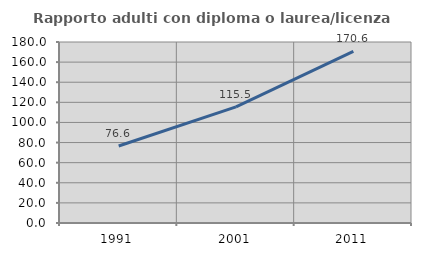
| Category | Rapporto adulti con diploma o laurea/licenza media  |
|---|---|
| 1991.0 | 76.564 |
| 2001.0 | 115.475 |
| 2011.0 | 170.621 |